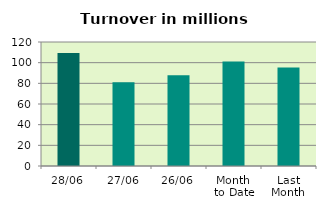
| Category | Series 0 |
|---|---|
| 28/06 | 109.355 |
| 27/06 | 80.977 |
| 26/06 | 87.874 |
| Month 
to Date | 101.166 |
| Last
Month | 95.269 |